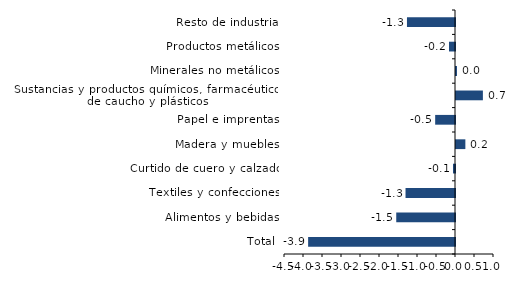
| Category | Series 0 |
|---|---|
| Total | -3.865 |
| Alimentos y bebidas | -1.546 |
| Textiles y confecciones | -1.302 |
| Curtido de cuero y calzado | -0.053 |
| Madera y muebles | 0.246 |
| Papel e imprentas | -0.522 |
| Sustancias y productos químicos, farmacéuticos, de caucho y plásticos | 0.708 |
| Minerales no metálicos | 0.026 |
| Productos metálicos | -0.158 |
| Resto de industria | -1.264 |